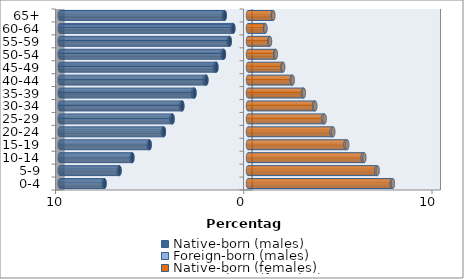
| Category | Native-born (males) | Foreign-born (males) | Native-born (females) | Foreign-born (females) |
|---|---|---|---|---|
| 0-4 | -7.621 | -0.047 | 7.639 | 0.059 |
| 5-9 | -6.826 | -0.041 | 6.819 | 0.068 |
| 10-14 | -6.144 | -0.037 | 6.101 | 0.078 |
| 15-19 | -5.226 | -0.041 | 5.187 | 0.083 |
| 20-24 | -4.471 | -0.049 | 4.447 | 0.083 |
| 25-29 | -4.011 | -0.06 | 4 | 0.076 |
| 30-34 | -3.492 | -0.073 | 3.511 | 0.064 |
| 35-39 | -2.845 | -0.085 | 2.918 | 0.05 |
| 40-44 | -2.213 | -0.091 | 2.335 | 0.042 |
| 45-49 | -1.682 | -0.088 | 1.836 | 0.034 |
| 50-54 | -1.281 | -0.078 | 1.448 | 0.028 |
| 55-59 | -0.972 | -0.062 | 1.146 | 0.024 |
| 60-64 | -0.78 | -0.045 | 0.907 | 0.018 |
| 65+ | -1.239 | -0.053 | 1.322 | 0.024 |